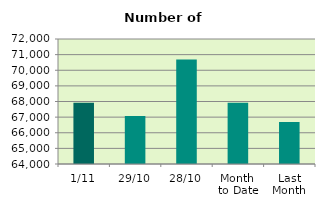
| Category | Series 0 |
|---|---|
| 1/11 | 67922 |
| 29/10 | 67080 |
| 28/10 | 70686 |
| Month 
to Date | 67922 |
| Last
Month | 66688.857 |